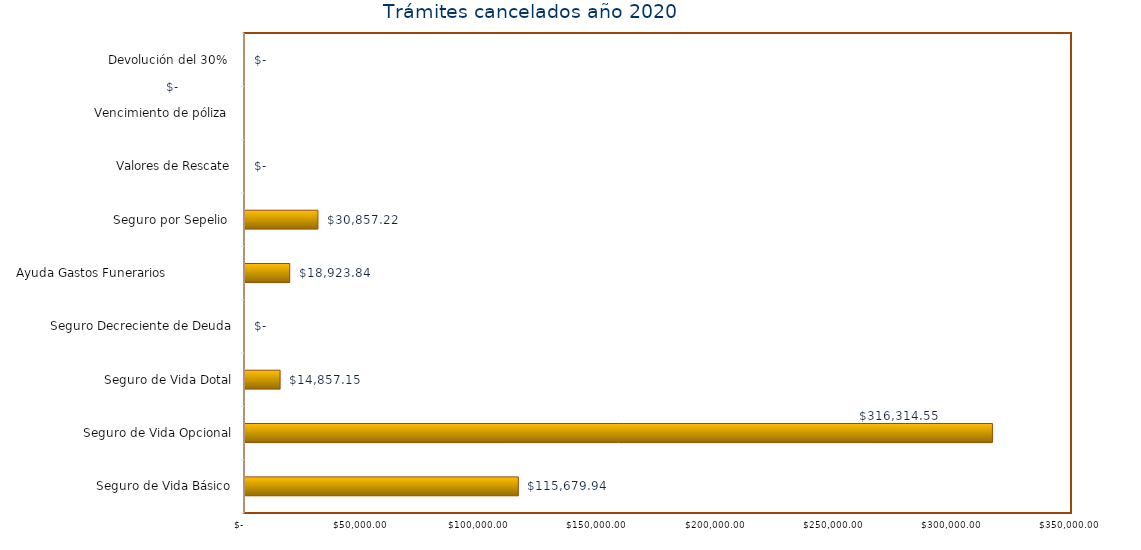
| Category | Monto  |
|---|---|
| Seguro de Vida Básico | 115679.94 |
| Seguro de Vida Opcional | 316314.55 |
| Seguro de Vida Dotal | 14857.15 |
| Seguro Decreciente de Deuda | 0 |
| Ayuda Gastos Funerarios                  | 18923.84 |
| Seguro por Sepelio  | 30857.22 |
| Valores de Rescate | 0 |
| Vencimiento de póliza  | 0 |
| Devolución del 30%  | 0 |